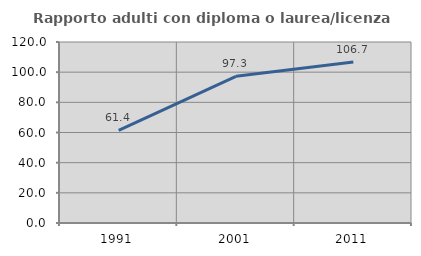
| Category | Rapporto adulti con diploma o laurea/licenza media  |
|---|---|
| 1991.0 | 61.386 |
| 2001.0 | 97.267 |
| 2011.0 | 106.702 |